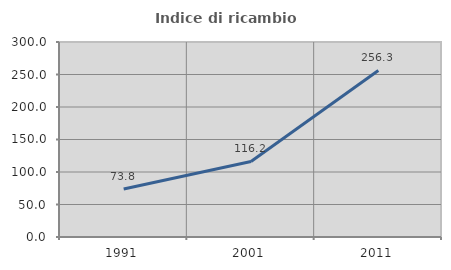
| Category | Indice di ricambio occupazionale  |
|---|---|
| 1991.0 | 73.85 |
| 2001.0 | 116.198 |
| 2011.0 | 256.295 |